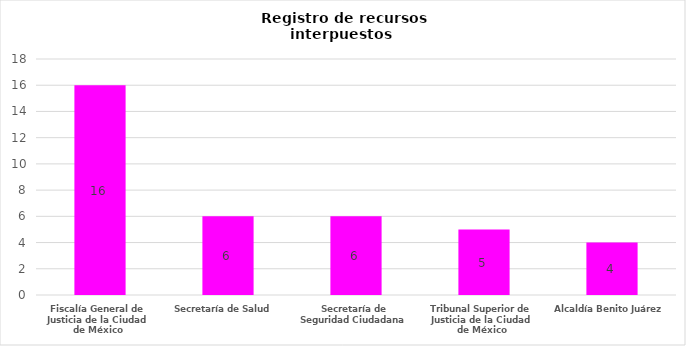
| Category | Registro de recursos interpuestos (DP) |
|---|---|
| Fiscalía General de Justicia de la Ciudad de México | 16 |
| Secretaría de Salud | 6 |
| Secretaría de Seguridad Ciudadana | 6 |
| Tribunal Superior de Justicia de la Ciudad de México | 5 |
| Alcaldía Benito Juárez | 4 |